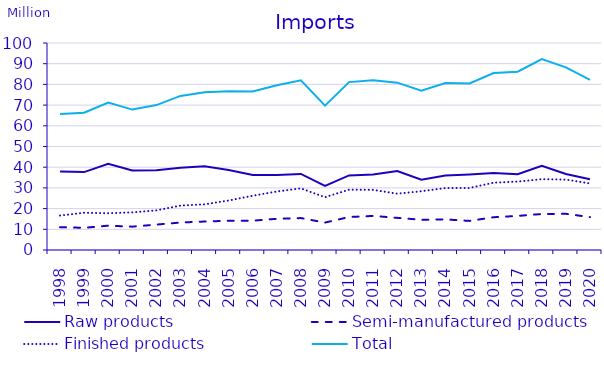
| Category | Raw products | Semi-manufactured products | Finished products | Total |
|---|---|---|---|---|
| 1998.0 | 37.966 | 11.014 | 16.661 | 65.641 |
| 1999.0 | 37.636 | 10.727 | 17.985 | 66.347 |
| 2000.0 | 41.688 | 11.758 | 17.752 | 71.198 |
| 2001.0 | 38.371 | 11.277 | 18.182 | 67.83 |
| 2002.0 | 38.577 | 12.277 | 19.143 | 69.998 |
| 2003.0 | 39.734 | 13.273 | 21.444 | 74.451 |
| 2004.0 | 40.405 | 13.753 | 22.066 | 76.225 |
| 2005.0 | 38.684 | 14.132 | 23.906 | 76.722 |
| 2006.0 | 36.256 | 14.162 | 26.212 | 76.629 |
| 2007.0 | 36.27 | 15.078 | 28.265 | 79.613 |
| 2008.0 | 36.749 | 15.423 | 29.775 | 81.947 |
| 2009.0 | 30.949 | 13.254 | 25.507 | 69.71 |
| 2010.0 | 36.017 | 15.931 | 29.156 | 81.104 |
| 2011.0 | 36.516 | 16.464 | 29.052 | 82.032 |
| 2012.0 | 38.104 | 15.532 | 27.206 | 80.842 |
| 2013.0 | 33.918 | 14.615 | 28.394 | 76.928 |
| 2014.0 | 35.964 | 14.786 | 29.928 | 80.678 |
| 2015.0 | 36.447 | 14.052 | 29.959 | 80.457 |
| 2016.0 | 37.172 | 15.832 | 32.519 | 85.522 |
| 2017.0 | 36.644 | 16.467 | 33.047 | 86.158 |
| 2018.0 | 40.659 | 17.381 | 34.223 | 92.263 |
| 2019.0 | 36.723 | 17.482 | 34.014 | 88.218 |
| 2020.0 | 34.156 | 15.892 | 32.144 | 82.192 |